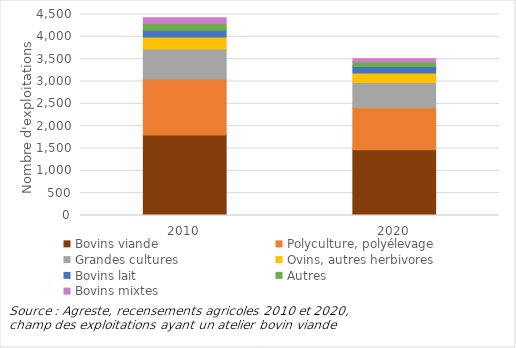
| Category | Bovins viande | Polyculture, polyélevage | Grandes cultures | Ovins, autres herbivores | Bovins lait | Autres | Bovins mixtes |
|---|---|---|---|---|---|---|---|
| 2010.0 | 1803 | 1255 | 671 | 265 | 152 | 152 | 131 |
| 2020.0 | 1472 | 940 | 567 | 214 | 143 | 102 | 74 |